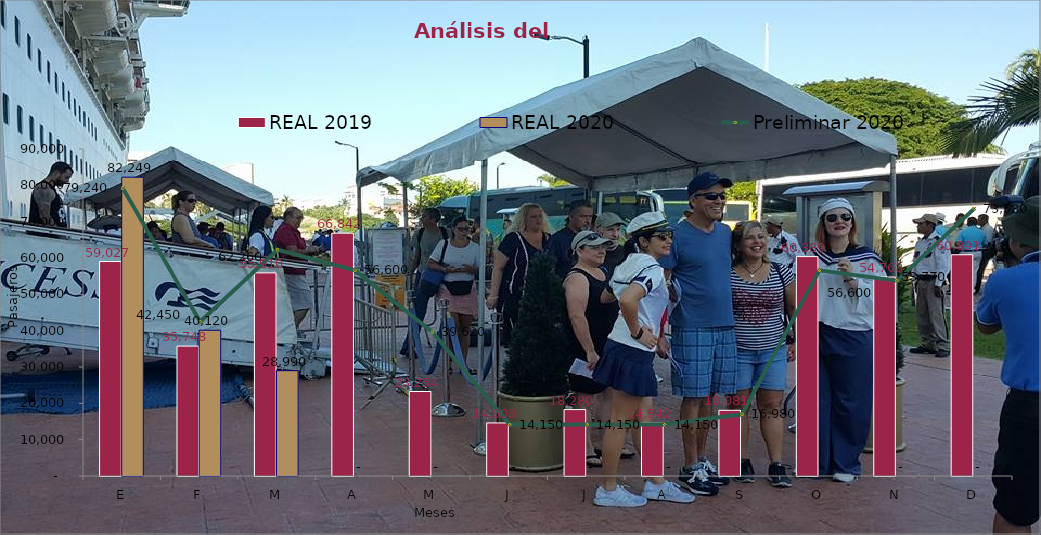
| Category | REAL 2019 | REAL 2020 |
|---|---|---|
| E | 59027 | 82249 |
| F | 35748 | 40120 |
| M | 55910 | 28990 |
| A | 66842 | 0 |
| M | 23254 | 0 |
| J | 14608 | 0 |
| J | 18280 | 0 |
| A | 14542 | 0 |
| S | 18081 | 0 |
| O | 60389 | 0 |
| N | 54763 | 0 |
| D | 60891 | 0 |